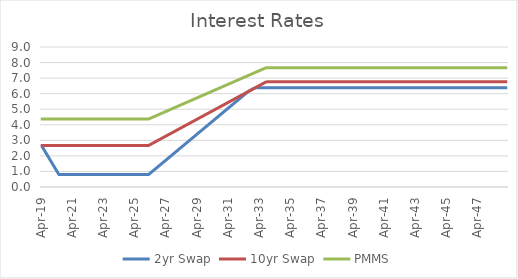
| Category | 2yr Swap | 10yr Swap | PMMS |
|---|---|---|---|
| 2019-04-30 | 2.617 | 2.669 | 4.371 |
| 2019-05-31 | 2.617 | 2.669 | 4.371 |
| 2019-06-30 | 2.477 | 2.669 | 4.371 |
| 2019-07-31 | 2.338 | 2.669 | 4.371 |
| 2019-08-31 | 2.199 | 2.669 | 4.371 |
| 2019-09-30 | 2.059 | 2.669 | 4.371 |
| 2019-10-31 | 1.92 | 2.669 | 4.371 |
| 2019-11-30 | 1.78 | 2.669 | 4.37 |
| 2019-12-31 | 1.641 | 2.669 | 4.37 |
| 2020-01-31 | 1.502 | 2.669 | 4.37 |
| 2020-02-29 | 1.362 | 2.669 | 4.37 |
| 2020-03-31 | 1.223 | 2.669 | 4.37 |
| 2020-04-30 | 1.084 | 2.669 | 4.37 |
| 2020-05-31 | 0.944 | 2.669 | 4.37 |
| 2020-06-30 | 0.805 | 2.669 | 4.37 |
| 2020-07-31 | 0.798 | 2.669 | 4.37 |
| 2020-08-31 | 0.798 | 2.669 | 4.37 |
| 2020-09-30 | 0.798 | 2.669 | 4.37 |
| 2020-10-31 | 0.798 | 2.669 | 4.37 |
| 2020-11-30 | 0.798 | 2.669 | 4.37 |
| 2020-12-31 | 0.798 | 2.669 | 4.37 |
| 2021-01-31 | 0.798 | 2.669 | 4.37 |
| 2021-02-28 | 0.798 | 2.669 | 4.37 |
| 2021-03-31 | 0.798 | 2.669 | 4.37 |
| 2021-04-30 | 0.798 | 2.669 | 4.37 |
| 2021-05-31 | 0.798 | 2.669 | 4.37 |
| 2021-06-30 | 0.798 | 2.669 | 4.37 |
| 2021-07-31 | 0.798 | 2.669 | 4.37 |
| 2021-08-31 | 0.798 | 2.669 | 4.37 |
| 2021-09-30 | 0.798 | 2.669 | 4.37 |
| 2021-10-31 | 0.798 | 2.669 | 4.37 |
| 2021-11-30 | 0.798 | 2.669 | 4.37 |
| 2021-12-31 | 0.798 | 2.669 | 4.37 |
| 2022-01-31 | 0.798 | 2.669 | 4.37 |
| 2022-02-28 | 0.798 | 2.669 | 4.37 |
| 2022-03-31 | 0.798 | 2.669 | 4.37 |
| 2022-04-30 | 0.798 | 2.669 | 4.37 |
| 2022-05-31 | 0.798 | 2.669 | 4.37 |
| 2022-06-30 | 0.798 | 2.669 | 4.37 |
| 2022-07-31 | 0.798 | 2.669 | 4.37 |
| 2022-08-31 | 0.798 | 2.669 | 4.37 |
| 2022-09-30 | 0.798 | 2.669 | 4.37 |
| 2022-10-31 | 0.798 | 2.669 | 4.37 |
| 2022-11-30 | 0.798 | 2.669 | 4.37 |
| 2022-12-31 | 0.798 | 2.669 | 4.37 |
| 2023-01-31 | 0.798 | 2.669 | 4.37 |
| 2023-02-28 | 0.798 | 2.669 | 4.37 |
| 2023-03-31 | 0.798 | 2.669 | 4.37 |
| 2023-04-30 | 0.798 | 2.669 | 4.37 |
| 2023-05-31 | 0.798 | 2.669 | 4.37 |
| 2023-06-30 | 0.798 | 2.669 | 4.37 |
| 2023-07-31 | 0.798 | 2.669 | 4.37 |
| 2023-08-31 | 0.798 | 2.669 | 4.37 |
| 2023-09-30 | 0.798 | 2.669 | 4.37 |
| 2023-10-31 | 0.798 | 2.669 | 4.37 |
| 2023-11-30 | 0.798 | 2.669 | 4.37 |
| 2023-12-31 | 0.798 | 2.669 | 4.37 |
| 2024-01-31 | 0.798 | 2.669 | 4.37 |
| 2024-02-29 | 0.798 | 2.669 | 4.37 |
| 2024-03-31 | 0.798 | 2.669 | 4.37 |
| 2024-04-30 | 0.798 | 2.669 | 4.37 |
| 2024-05-31 | 0.798 | 2.669 | 4.37 |
| 2024-06-30 | 0.798 | 2.669 | 4.37 |
| 2024-07-31 | 0.798 | 2.669 | 4.37 |
| 2024-08-31 | 0.798 | 2.669 | 4.37 |
| 2024-09-30 | 0.798 | 2.669 | 4.37 |
| 2024-10-31 | 0.798 | 2.669 | 4.37 |
| 2024-11-30 | 0.798 | 2.669 | 4.37 |
| 2024-12-31 | 0.798 | 2.669 | 4.37 |
| 2025-01-31 | 0.798 | 2.669 | 4.37 |
| 2025-02-28 | 0.798 | 2.669 | 4.37 |
| 2025-03-31 | 0.798 | 2.669 | 4.37 |
| 2025-04-30 | 0.798 | 2.669 | 4.37 |
| 2025-05-31 | 0.798 | 2.669 | 4.37 |
| 2025-06-30 | 0.798 | 2.669 | 4.37 |
| 2025-07-31 | 0.798 | 2.669 | 4.37 |
| 2025-08-31 | 0.798 | 2.669 | 4.37 |
| 2025-09-30 | 0.798 | 2.669 | 4.37 |
| 2025-10-31 | 0.798 | 2.669 | 4.37 |
| 2025-11-30 | 0.798 | 2.669 | 4.37 |
| 2025-12-31 | 0.798 | 2.669 | 4.37 |
| 2026-01-31 | 0.798 | 2.669 | 4.37 |
| 2026-02-28 | 0.798 | 2.669 | 4.37 |
| 2026-03-31 | 0.798 | 2.669 | 4.37 |
| 2026-04-30 | 0.868 | 2.714 | 4.406 |
| 2026-05-31 | 0.938 | 2.759 | 4.443 |
| 2026-06-30 | 1.007 | 2.805 | 4.479 |
| 2026-07-31 | 1.077 | 2.85 | 4.516 |
| 2026-08-31 | 1.147 | 2.895 | 4.552 |
| 2026-09-30 | 1.216 | 2.94 | 4.589 |
| 2026-10-31 | 1.286 | 2.985 | 4.625 |
| 2026-11-30 | 1.356 | 3.031 | 4.662 |
| 2026-12-31 | 1.425 | 3.076 | 4.698 |
| 2027-01-31 | 1.495 | 3.121 | 4.735 |
| 2027-02-28 | 1.565 | 3.166 | 4.771 |
| 2027-03-31 | 1.634 | 3.212 | 4.807 |
| 2027-04-30 | 1.704 | 3.257 | 4.844 |
| 2027-05-31 | 1.774 | 3.302 | 4.88 |
| 2027-06-30 | 1.843 | 3.347 | 4.917 |
| 2027-07-31 | 1.913 | 3.392 | 4.953 |
| 2027-08-31 | 1.983 | 3.438 | 4.99 |
| 2027-09-30 | 2.052 | 3.483 | 5.026 |
| 2027-10-31 | 2.122 | 3.528 | 5.063 |
| 2027-11-30 | 2.192 | 3.573 | 5.099 |
| 2027-12-31 | 2.261 | 3.619 | 5.136 |
| 2028-01-31 | 2.331 | 3.664 | 5.172 |
| 2028-02-29 | 2.401 | 3.709 | 5.209 |
| 2028-03-31 | 2.47 | 3.754 | 5.245 |
| 2028-04-30 | 2.54 | 3.799 | 5.282 |
| 2028-05-31 | 2.61 | 3.845 | 5.318 |
| 2028-06-30 | 2.679 | 3.89 | 5.355 |
| 2028-07-31 | 2.749 | 3.935 | 5.391 |
| 2028-08-31 | 2.819 | 3.98 | 5.428 |
| 2028-09-30 | 2.888 | 4.026 | 5.464 |
| 2028-10-31 | 2.958 | 4.071 | 5.501 |
| 2028-11-30 | 3.028 | 4.116 | 5.537 |
| 2028-12-31 | 3.097 | 4.161 | 5.574 |
| 2029-01-31 | 3.167 | 4.206 | 5.61 |
| 2029-02-28 | 3.237 | 4.252 | 5.647 |
| 2029-03-31 | 3.306 | 4.297 | 5.683 |
| 2029-04-30 | 3.376 | 4.342 | 5.719 |
| 2029-05-31 | 3.446 | 4.387 | 5.756 |
| 2029-06-30 | 3.515 | 4.433 | 5.792 |
| 2029-07-31 | 3.585 | 4.478 | 5.829 |
| 2029-08-31 | 3.655 | 4.523 | 5.865 |
| 2029-09-30 | 3.724 | 4.568 | 5.902 |
| 2029-10-31 | 3.794 | 4.613 | 5.938 |
| 2029-11-30 | 3.864 | 4.659 | 5.975 |
| 2029-12-31 | 3.933 | 4.704 | 6.011 |
| 2030-01-31 | 4.003 | 4.749 | 6.048 |
| 2030-02-28 | 4.073 | 4.794 | 6.084 |
| 2030-03-31 | 4.142 | 4.84 | 6.121 |
| 2030-04-30 | 4.212 | 4.885 | 6.157 |
| 2030-05-31 | 4.282 | 4.93 | 6.194 |
| 2030-06-30 | 4.351 | 4.975 | 6.23 |
| 2030-07-31 | 4.421 | 5.02 | 6.267 |
| 2030-08-31 | 4.491 | 5.066 | 6.303 |
| 2030-09-30 | 4.56 | 5.111 | 6.34 |
| 2030-10-31 | 4.63 | 5.156 | 6.376 |
| 2030-11-30 | 4.7 | 5.201 | 6.413 |
| 2030-12-31 | 4.769 | 5.247 | 6.449 |
| 2031-01-31 | 4.839 | 5.292 | 6.486 |
| 2031-02-28 | 4.909 | 5.337 | 6.522 |
| 2031-03-31 | 4.978 | 5.382 | 6.559 |
| 2031-04-30 | 5.048 | 5.427 | 6.595 |
| 2031-05-31 | 5.118 | 5.473 | 6.631 |
| 2031-06-30 | 5.187 | 5.518 | 6.668 |
| 2031-07-31 | 5.257 | 5.563 | 6.704 |
| 2031-08-31 | 5.327 | 5.608 | 6.741 |
| 2031-09-30 | 5.396 | 5.654 | 6.777 |
| 2031-10-31 | 5.466 | 5.699 | 6.814 |
| 2031-11-30 | 5.536 | 5.744 | 6.85 |
| 2031-12-31 | 5.605 | 5.789 | 6.887 |
| 2032-01-31 | 5.675 | 5.834 | 6.923 |
| 2032-02-29 | 5.745 | 5.88 | 6.96 |
| 2032-03-31 | 5.814 | 5.925 | 6.996 |
| 2032-04-30 | 5.884 | 5.97 | 7.033 |
| 2032-05-31 | 5.954 | 6.015 | 7.069 |
| 2032-06-30 | 6.023 | 6.06 | 7.106 |
| 2032-07-31 | 6.093 | 6.106 | 7.142 |
| 2032-08-31 | 6.151 | 6.151 | 7.179 |
| 2032-09-30 | 6.196 | 6.196 | 7.215 |
| 2032-10-31 | 6.241 | 6.241 | 7.252 |
| 2032-11-30 | 6.287 | 6.287 | 7.288 |
| 2032-12-31 | 6.332 | 6.332 | 7.325 |
| 2033-01-31 | 6.377 | 6.377 | 7.361 |
| 2033-02-28 | 6.387 | 6.422 | 7.397 |
| 2033-03-31 | 6.387 | 6.467 | 7.434 |
| 2033-04-30 | 6.387 | 6.513 | 7.47 |
| 2033-05-31 | 6.387 | 6.558 | 7.507 |
| 2033-06-30 | 6.387 | 6.603 | 7.543 |
| 2033-07-31 | 6.387 | 6.648 | 7.58 |
| 2033-08-31 | 6.387 | 6.694 | 7.616 |
| 2033-09-30 | 6.387 | 6.739 | 7.652 |
| 2033-10-31 | 6.387 | 6.758 | 7.668 |
| 2033-11-30 | 6.387 | 6.758 | 7.668 |
| 2033-12-31 | 6.387 | 6.758 | 7.668 |
| 2034-01-31 | 6.387 | 6.758 | 7.668 |
| 2034-02-28 | 6.387 | 6.758 | 7.668 |
| 2034-03-31 | 6.387 | 6.758 | 7.668 |
| 2034-04-30 | 6.387 | 6.758 | 7.668 |
| 2034-05-31 | 6.387 | 6.758 | 7.668 |
| 2034-06-30 | 6.387 | 6.758 | 7.668 |
| 2034-07-31 | 6.387 | 6.758 | 7.668 |
| 2034-08-31 | 6.387 | 6.758 | 7.668 |
| 2034-09-30 | 6.387 | 6.758 | 7.668 |
| 2034-10-31 | 6.387 | 6.758 | 7.668 |
| 2034-11-30 | 6.387 | 6.758 | 7.668 |
| 2034-12-31 | 6.387 | 6.758 | 7.668 |
| 2035-01-31 | 6.387 | 6.758 | 7.668 |
| 2035-02-28 | 6.387 | 6.758 | 7.668 |
| 2035-03-31 | 6.387 | 6.758 | 7.668 |
| 2035-04-30 | 6.387 | 6.758 | 7.668 |
| 2035-05-31 | 6.387 | 6.758 | 7.668 |
| 2035-06-30 | 6.387 | 6.758 | 7.668 |
| 2035-07-31 | 6.387 | 6.758 | 7.668 |
| 2035-08-31 | 6.387 | 6.758 | 7.668 |
| 2035-09-30 | 6.387 | 6.758 | 7.668 |
| 2035-10-31 | 6.387 | 6.758 | 7.668 |
| 2035-11-30 | 6.387 | 6.758 | 7.668 |
| 2035-12-31 | 6.387 | 6.758 | 7.668 |
| 2036-01-31 | 6.387 | 6.758 | 7.668 |
| 2036-02-29 | 6.387 | 6.758 | 7.668 |
| 2036-03-31 | 6.387 | 6.758 | 7.668 |
| 2036-04-30 | 6.387 | 6.758 | 7.668 |
| 2036-05-31 | 6.387 | 6.758 | 7.668 |
| 2036-06-30 | 6.387 | 6.758 | 7.668 |
| 2036-07-31 | 6.387 | 6.758 | 7.668 |
| 2036-08-31 | 6.387 | 6.758 | 7.668 |
| 2036-09-30 | 6.387 | 6.758 | 7.668 |
| 2036-10-31 | 6.387 | 6.758 | 7.668 |
| 2036-11-30 | 6.387 | 6.758 | 7.668 |
| 2036-12-31 | 6.387 | 6.758 | 7.668 |
| 2037-01-31 | 6.387 | 6.758 | 7.668 |
| 2037-02-28 | 6.387 | 6.758 | 7.668 |
| 2037-03-31 | 6.387 | 6.758 | 7.668 |
| 2037-04-30 | 6.387 | 6.758 | 7.668 |
| 2037-05-31 | 6.387 | 6.758 | 7.668 |
| 2037-06-30 | 6.387 | 6.758 | 7.668 |
| 2037-07-31 | 6.387 | 6.758 | 7.668 |
| 2037-08-31 | 6.387 | 6.758 | 7.668 |
| 2037-09-30 | 6.387 | 6.758 | 7.668 |
| 2037-10-31 | 6.387 | 6.758 | 7.668 |
| 2037-11-30 | 6.387 | 6.758 | 7.668 |
| 2037-12-31 | 6.387 | 6.758 | 7.668 |
| 2038-01-31 | 6.387 | 6.758 | 7.668 |
| 2038-02-28 | 6.387 | 6.758 | 7.668 |
| 2038-03-31 | 6.387 | 6.758 | 7.668 |
| 2038-04-30 | 6.387 | 6.758 | 7.668 |
| 2038-05-31 | 6.387 | 6.758 | 7.668 |
| 2038-06-30 | 6.387 | 6.758 | 7.668 |
| 2038-07-31 | 6.387 | 6.758 | 7.668 |
| 2038-08-31 | 6.387 | 6.758 | 7.668 |
| 2038-09-30 | 6.387 | 6.758 | 7.668 |
| 2038-10-31 | 6.387 | 6.758 | 7.668 |
| 2038-11-30 | 6.387 | 6.758 | 7.668 |
| 2038-12-31 | 6.387 | 6.758 | 7.668 |
| 2039-01-31 | 6.387 | 6.758 | 7.668 |
| 2039-02-28 | 6.387 | 6.758 | 7.668 |
| 2039-03-31 | 6.387 | 6.758 | 7.668 |
| 2039-04-30 | 6.387 | 6.758 | 7.668 |
| 2039-05-31 | 6.387 | 6.758 | 7.668 |
| 2039-06-30 | 6.387 | 6.758 | 7.668 |
| 2039-07-31 | 6.387 | 6.758 | 7.668 |
| 2039-08-31 | 6.387 | 6.758 | 7.668 |
| 2039-09-30 | 6.387 | 6.758 | 7.668 |
| 2039-10-31 | 6.387 | 6.758 | 7.668 |
| 2039-11-30 | 6.387 | 6.758 | 7.668 |
| 2039-12-31 | 6.387 | 6.758 | 7.668 |
| 2040-01-31 | 6.387 | 6.758 | 7.668 |
| 2040-02-29 | 6.387 | 6.758 | 7.668 |
| 2040-03-31 | 6.387 | 6.758 | 7.668 |
| 2040-04-30 | 6.387 | 6.758 | 7.668 |
| 2040-05-31 | 6.387 | 6.758 | 7.668 |
| 2040-06-30 | 6.387 | 6.758 | 7.668 |
| 2040-07-31 | 6.387 | 6.758 | 7.668 |
| 2040-08-31 | 6.387 | 6.758 | 7.668 |
| 2040-09-30 | 6.387 | 6.758 | 7.668 |
| 2040-10-31 | 6.387 | 6.758 | 7.668 |
| 2040-11-30 | 6.387 | 6.758 | 7.668 |
| 2040-12-31 | 6.387 | 6.758 | 7.668 |
| 2041-01-31 | 6.387 | 6.758 | 7.668 |
| 2041-02-28 | 6.387 | 6.758 | 7.668 |
| 2041-03-31 | 6.387 | 6.758 | 7.668 |
| 2041-04-30 | 6.387 | 6.758 | 7.668 |
| 2041-05-31 | 6.387 | 6.758 | 7.668 |
| 2041-06-30 | 6.387 | 6.758 | 7.668 |
| 2041-07-31 | 6.387 | 6.758 | 7.668 |
| 2041-08-31 | 6.387 | 6.758 | 7.668 |
| 2041-09-30 | 6.387 | 6.758 | 7.668 |
| 2041-10-31 | 6.387 | 6.758 | 7.668 |
| 2041-11-30 | 6.387 | 6.758 | 7.668 |
| 2041-12-31 | 6.387 | 6.758 | 7.668 |
| 2042-01-31 | 6.387 | 6.758 | 7.668 |
| 2042-02-28 | 6.387 | 6.758 | 7.668 |
| 2042-03-31 | 6.387 | 6.758 | 7.668 |
| 2042-04-30 | 6.387 | 6.758 | 7.668 |
| 2042-05-31 | 6.387 | 6.758 | 7.668 |
| 2042-06-30 | 6.387 | 6.758 | 7.668 |
| 2042-07-31 | 6.387 | 6.758 | 7.668 |
| 2042-08-31 | 6.387 | 6.758 | 7.668 |
| 2042-09-30 | 6.387 | 6.758 | 7.668 |
| 2042-10-31 | 6.387 | 6.758 | 7.668 |
| 2042-11-30 | 6.387 | 6.758 | 7.668 |
| 2042-12-31 | 6.387 | 6.758 | 7.668 |
| 2043-01-31 | 6.387 | 6.758 | 7.668 |
| 2043-02-28 | 6.387 | 6.758 | 7.668 |
| 2043-03-31 | 6.387 | 6.758 | 7.668 |
| 2043-04-30 | 6.387 | 6.758 | 7.668 |
| 2043-05-31 | 6.387 | 6.758 | 7.668 |
| 2043-06-30 | 6.387 | 6.758 | 7.668 |
| 2043-07-31 | 6.387 | 6.758 | 7.668 |
| 2043-08-31 | 6.387 | 6.758 | 7.668 |
| 2043-09-30 | 6.387 | 6.758 | 7.668 |
| 2043-10-31 | 6.387 | 6.758 | 7.668 |
| 2043-11-30 | 6.387 | 6.758 | 7.668 |
| 2043-12-31 | 6.387 | 6.758 | 7.668 |
| 2044-01-31 | 6.387 | 6.758 | 7.668 |
| 2044-02-29 | 6.387 | 6.758 | 7.668 |
| 2044-03-31 | 6.387 | 6.758 | 7.668 |
| 2044-04-30 | 6.387 | 6.758 | 7.668 |
| 2044-05-31 | 6.387 | 6.758 | 7.668 |
| 2044-06-30 | 6.387 | 6.758 | 7.668 |
| 2044-07-31 | 6.387 | 6.758 | 7.668 |
| 2044-08-31 | 6.387 | 6.758 | 7.668 |
| 2044-09-30 | 6.387 | 6.758 | 7.668 |
| 2044-10-31 | 6.387 | 6.758 | 7.668 |
| 2044-11-30 | 6.387 | 6.758 | 7.668 |
| 2044-12-31 | 6.387 | 6.758 | 7.668 |
| 2045-01-31 | 6.387 | 6.758 | 7.668 |
| 2045-02-28 | 6.387 | 6.758 | 7.668 |
| 2045-03-31 | 6.387 | 6.758 | 7.668 |
| 2045-04-30 | 6.387 | 6.758 | 7.668 |
| 2045-05-31 | 6.387 | 6.758 | 7.668 |
| 2045-06-30 | 6.387 | 6.758 | 7.668 |
| 2045-07-31 | 6.387 | 6.758 | 7.668 |
| 2045-08-31 | 6.387 | 6.758 | 7.668 |
| 2045-09-30 | 6.387 | 6.758 | 7.668 |
| 2045-10-31 | 6.387 | 6.758 | 7.668 |
| 2045-11-30 | 6.387 | 6.758 | 7.668 |
| 2045-12-31 | 6.387 | 6.758 | 7.668 |
| 2046-01-31 | 6.387 | 6.758 | 7.668 |
| 2046-02-28 | 6.387 | 6.758 | 7.668 |
| 2046-03-31 | 6.387 | 6.758 | 7.668 |
| 2046-04-30 | 6.387 | 6.758 | 7.668 |
| 2046-05-31 | 6.387 | 6.758 | 7.668 |
| 2046-06-30 | 6.387 | 6.758 | 7.668 |
| 2046-07-31 | 6.387 | 6.758 | 7.668 |
| 2046-08-31 | 6.387 | 6.758 | 7.668 |
| 2046-09-30 | 6.387 | 6.758 | 7.668 |
| 2046-10-31 | 6.387 | 6.758 | 7.668 |
| 2046-11-30 | 6.387 | 6.758 | 7.668 |
| 2046-12-31 | 6.387 | 6.758 | 7.668 |
| 2047-01-31 | 6.387 | 6.758 | 7.668 |
| 2047-02-28 | 6.387 | 6.758 | 7.668 |
| 2047-03-31 | 6.387 | 6.758 | 7.668 |
| 2047-04-30 | 6.387 | 6.758 | 7.668 |
| 2047-05-31 | 6.387 | 6.758 | 7.668 |
| 2047-06-30 | 6.387 | 6.758 | 7.668 |
| 2047-07-31 | 6.387 | 6.758 | 7.668 |
| 2047-08-31 | 6.387 | 6.758 | 7.668 |
| 2047-09-30 | 6.387 | 6.758 | 7.668 |
| 2047-10-31 | 6.387 | 6.758 | 7.668 |
| 2047-11-30 | 6.387 | 6.758 | 7.668 |
| 2047-12-31 | 6.387 | 6.758 | 7.668 |
| 2048-01-31 | 6.387 | 6.758 | 7.668 |
| 2048-02-29 | 6.387 | 6.758 | 7.668 |
| 2048-03-31 | 6.387 | 6.758 | 7.668 |
| 2048-04-30 | 6.387 | 6.758 | 7.668 |
| 2048-05-31 | 6.387 | 6.758 | 7.668 |
| 2048-06-30 | 6.387 | 6.758 | 7.668 |
| 2048-07-31 | 6.387 | 6.758 | 7.668 |
| 2048-08-31 | 6.387 | 6.758 | 7.668 |
| 2048-09-30 | 6.387 | 6.758 | 7.668 |
| 2048-10-31 | 6.387 | 6.758 | 7.668 |
| 2048-11-30 | 6.387 | 6.758 | 7.668 |
| 2048-12-31 | 6.387 | 6.758 | 7.668 |
| 2049-01-31 | 6.387 | 6.758 | 7.668 |
| 2049-02-28 | 6.387 | 6.758 | 7.668 |
| 2049-03-31 | 6.387 | 6.758 | 7.668 |